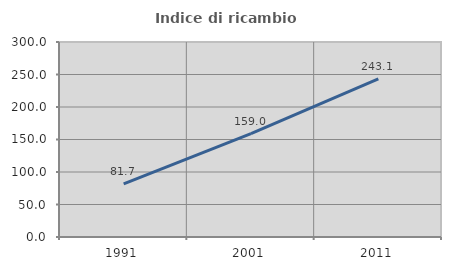
| Category | Indice di ricambio occupazionale  |
|---|---|
| 1991.0 | 81.699 |
| 2001.0 | 159.041 |
| 2011.0 | 243.107 |